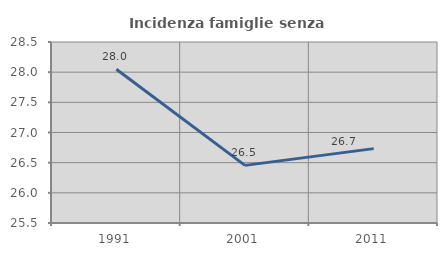
| Category | Incidenza famiglie senza nuclei |
|---|---|
| 1991.0 | 28.049 |
| 2001.0 | 26.455 |
| 2011.0 | 26.733 |